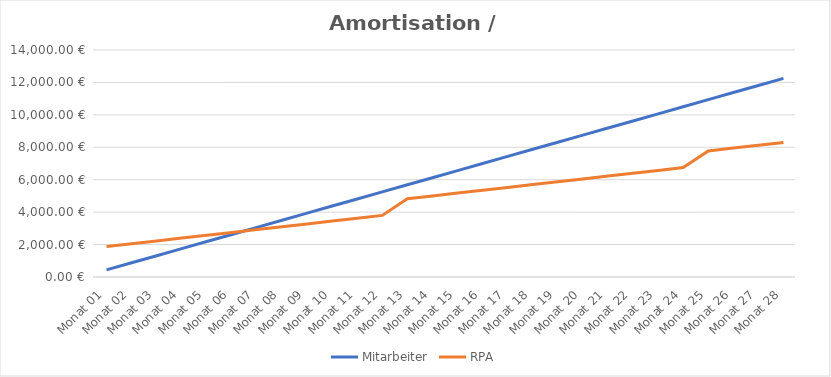
| Category | Mitarbeiter | RPA |
|---|---|---|
| Monat 01 | 437.5 | 1875 |
| Monat 02 | 875 | 2050 |
| Monat 03 | 1312.5 | 2225 |
| Monat 04 | 1750 | 2400 |
| Monat 05 | 2187.5 | 2575 |
| Monat 06 | 2625 | 2750 |
| Monat 07 | 3062.5 | 2925 |
| Monat 08 | 3500 | 3100 |
| Monat 09 | 3937.5 | 3275 |
| Monat 10 | 4375 | 3450 |
| Monat 11 | 4812.5 | 3625 |
| Monat 12 | 5250 | 3800 |
| Monat 13 | 5687.5 | 4825 |
| Monat 14 | 6125 | 5000 |
| Monat 15 | 6562.5 | 5175 |
| Monat 16 | 7000 | 5350 |
| Monat 17 | 7437.5 | 5525 |
| Monat 18 | 7875 | 5700 |
| Monat 19 | 8312.5 | 5875 |
| Monat 20 | 8750 | 6050 |
| Monat 21 | 9187.5 | 6225 |
| Monat 22 | 9625 | 6400 |
| Monat 23 | 10062.5 | 6575 |
| Monat 24 | 10500 | 6750 |
| Monat 25 | 10937.5 | 7775 |
| Monat 26 | 11375 | 7950 |
| Monat 27 | 11812.5 | 8125 |
| Monat 28 | 12250 | 8300 |